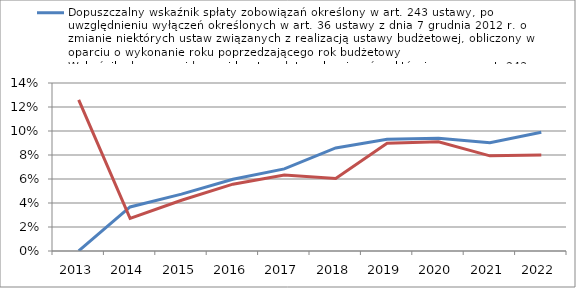
| Category | Dopuszczalny wskaźnik spłaty zobowiązań określony w art. 243 ustawy, po uwzględnieniu wyłączeń określonych w art. 36 ustawy z dnia 7 grudnia 2012 r. o zmianie niektórych ustaw związanych z realizacją ustawy budżetowej, obliczony w oparciu o wykonanie roku | Wskaźnik planowanej łącznej kwoty spłaty zobowiązań, o której mowa w art. 243 ust. 1 ustawy do dochodów ogółem, po uwzględnieniu zobowiązań związku współtworzonego przez jednostkę samorządu terytorialnego oraz po uwzględnieniu wyłączeń przypadających na d |
|---|---|---|
| 2013.0 | 0 | 0.126 |
| 2014.0 | 0.037 | 0.027 |
| 2015.0 | 0.047 | 0.042 |
| 2016.0 | 0.06 | 0.056 |
| 2017.0 | 0.068 | 0.063 |
| 2018.0 | 0.086 | 0.06 |
| 2019.0 | 0.093 | 0.09 |
| 2020.0 | 0.094 | 0.091 |
| 2021.0 | 0.09 | 0.079 |
| 2022.0 | 0.099 | 0.08 |